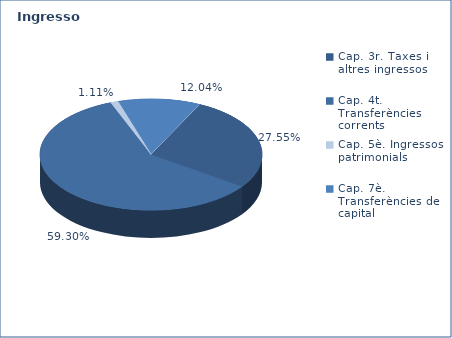
| Category | Series 0 |
|---|---|
| Cap. 3r. Taxes i altres ingressos | 81251546 |
| Cap. 4t. Transferències corrents | 174928309 |
| Cap. 5è. Ingressos patrimonials | 3264375 |
| Cap. 7è. Transferències de capital | 35520806 |
| Cap. 8è. Actius financers | 0 |
| Cap. 9è. Préstecs | 0 |